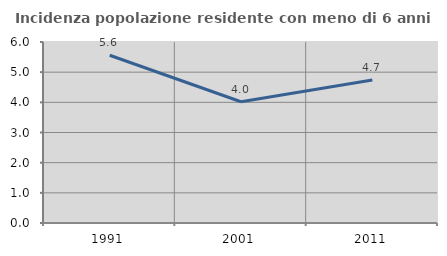
| Category | Incidenza popolazione residente con meno di 6 anni |
|---|---|
| 1991.0 | 5.561 |
| 2001.0 | 4.021 |
| 2011.0 | 4.742 |